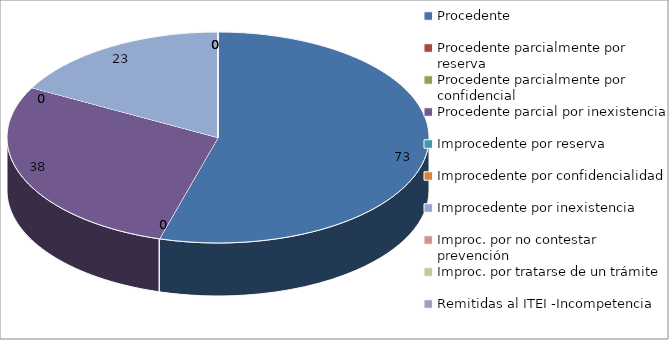
| Category | Series 0 |
|---|---|
| Procedente | 73 |
| Procedente parcialmente por reserva  | 0 |
| Procedente parcialmente por confidencial | 0 |
| Procedente parcial por inexistencia | 38 |
| Improcedente por reserva  | 0 |
| Improcedente por confidencialidad | 0 |
| Improcedente por inexistencia  | 23 |
| Improc. por no contestar prevención | 0 |
| Improc. por tratarse de un trámite  | 0 |
| Remitidas al ITEI -Incompetencia  | 0 |